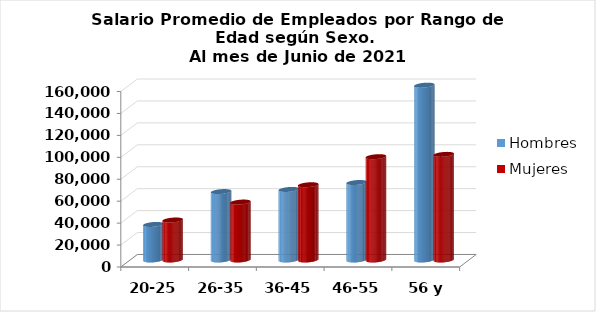
| Category | Hombres | Mujeres |
|---|---|---|
| 20-25 | 32428 | 36452 |
| 26-35 | 62389 | 52821 |
| 36-45 | 64347 | 68602 |
| 46-55 | 70653 | 94205 |
| 56 y más | 159403 | 96309 |